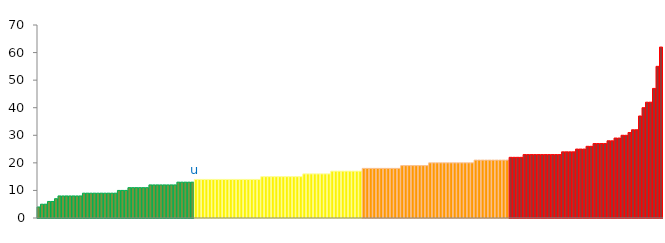
| Category | Top Quartile | 2nd Quartile | 3rd Quartile | Bottom Quartile | Series 4 |
|---|---|---|---|---|---|
|  | 4 | 0 | 0 | 0 | 4 |
|  | 5 | 0 | 0 | 0 | 5 |
|  | 5 | 0 | 0 | 0 | 5 |
|  | 6 | 0 | 0 | 0 | 6 |
|  | 6 | 0 | 0 | 0 | 6 |
|  | 7 | 0 | 0 | 0 | 7 |
|  | 8 | 0 | 0 | 0 | 8 |
|  | 8 | 0 | 0 | 0 | 8 |
|  | 8 | 0 | 0 | 0 | 8 |
|  | 8 | 0 | 0 | 0 | 8 |
|  | 8 | 0 | 0 | 0 | 8 |
|  | 8 | 0 | 0 | 0 | 8 |
|  | 8 | 0 | 0 | 0 | 8 |
|  | 9 | 0 | 0 | 0 | 9 |
|  | 9 | 0 | 0 | 0 | 9 |
|  | 9 | 0 | 0 | 0 | 9 |
|  | 9 | 0 | 0 | 0 | 9 |
|  | 9 | 0 | 0 | 0 | 9 |
|  | 9 | 0 | 0 | 0 | 9 |
|  | 9 | 0 | 0 | 0 | 9 |
|  | 9 | 0 | 0 | 0 | 9 |
|  | 9 | 0 | 0 | 0 | 9 |
|  | 9 | 0 | 0 | 0 | 9 |
|  | 10 | 0 | 0 | 0 | 10 |
|  | 10 | 0 | 0 | 0 | 10 |
|  | 10 | 0 | 0 | 0 | 10 |
|  | 11 | 0 | 0 | 0 | 11 |
|  | 11 | 0 | 0 | 0 | 11 |
|  | 11 | 0 | 0 | 0 | 11 |
|  | 11 | 0 | 0 | 0 | 11 |
|  | 11 | 0 | 0 | 0 | 11 |
|  | 11 | 0 | 0 | 0 | 11 |
|  | 12 | 0 | 0 | 0 | 12 |
|  | 12 | 0 | 0 | 0 | 12 |
|  | 12 | 0 | 0 | 0 | 12 |
|  | 12 | 0 | 0 | 0 | 12 |
|  | 12 | 0 | 0 | 0 | 12 |
|  | 12 | 0 | 0 | 0 | 12 |
|  | 12 | 0 | 0 | 0 | 12 |
|  | 12 | 0 | 0 | 0 | 12 |
|  | 13 | 0 | 0 | 0 | 13 |
|  | 13 | 0 | 0 | 0 | 13 |
|  | 13 | 0 | 0 | 0 | 13 |
|  | 13 | 0 | 0 | 0 | 13 |
|  | 13 | 0 | 0 | 0 | 13 |
| u | 0 | 14 | 0 | 0 | 14 |